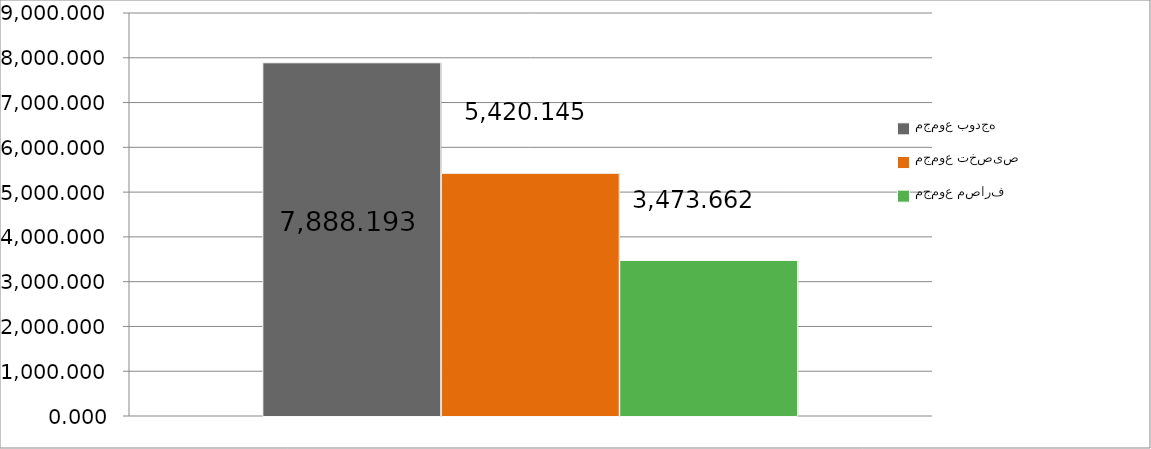
| Category | مجموع بودجه  | مجموع تخصیص | مجموع مصارف |
|---|---|---|---|
| 0 | 7888.193 | 5420.145 | 3473.662 |